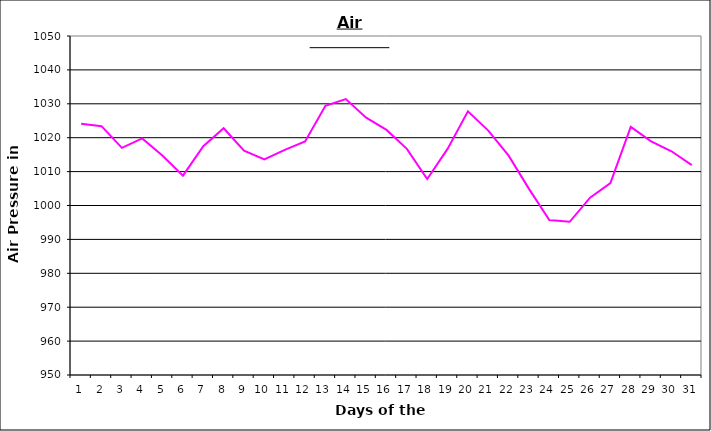
| Category | Series 0 |
|---|---|
| 0 | 1024.1 |
| 1 | 1023.4 |
| 2 | 1017 |
| 3 | 1019.8 |
| 4 | 1014.7 |
| 5 | 1008.8 |
| 6 | 1017.5 |
| 7 | 1022.8 |
| 8 | 1016.2 |
| 9 | 1013.6 |
| 10 | 1016.4 |
| 11 | 1018.9 |
| 12 | 1029.4 |
| 13 | 1031.4 |
| 14 | 1025.9 |
| 15 | 1022.3 |
| 16 | 1016.7 |
| 17 | 1007.8 |
| 18 | 1016.7 |
| 19 | 1027.8 |
| 20 | 1022.1 |
| 21 | 1014.7 |
| 22 | 1004.9 |
| 23 | 995.7 |
| 24 | 995.2 |
| 25 | 1002.3 |
| 26 | 1006.6 |
| 27 | 1023.2 |
| 28 | 1018.9 |
| 29 | 1016 |
| 30 | 1011.9 |